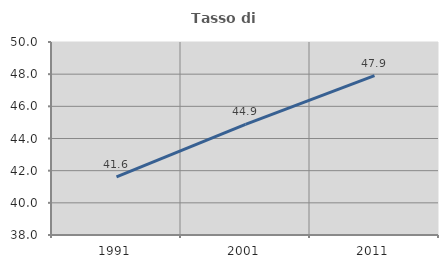
| Category | Tasso di occupazione   |
|---|---|
| 1991.0 | 41.62 |
| 2001.0 | 44.873 |
| 2011.0 | 47.907 |